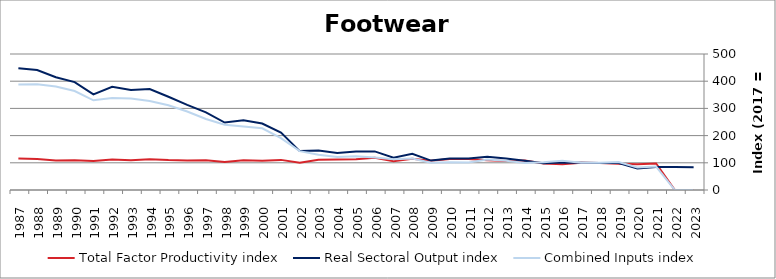
| Category | Total Factor Productivity index | Real Sectoral Output index | Combined Inputs index |
|---|---|---|---|
| 2023.0 | 0 | 83.648 | 0 |
| 2022.0 | 0 | 84.491 | 0 |
| 2021.0 | 97.686 | 84.185 | 86.18 |
| 2020.0 | 95.069 | 78.826 | 82.914 |
| 2019.0 | 96.535 | 99.028 | 102.582 |
| 2018.0 | 99.125 | 99.013 | 99.887 |
| 2017.0 | 100 | 100 | 100 |
| 2016.0 | 94.254 | 101.406 | 107.587 |
| 2015.0 | 97.122 | 98.709 | 101.635 |
| 2014.0 | 108.348 | 107.576 | 99.287 |
| 2013.0 | 106.946 | 115.383 | 107.889 |
| 2012.0 | 109.557 | 122.355 | 111.682 |
| 2011.0 | 114.334 | 115.851 | 101.327 |
| 2010.0 | 113.519 | 115.492 | 101.737 |
| 2009.0 | 107.527 | 108.194 | 100.62 |
| 2008.0 | 115.146 | 132.966 | 115.476 |
| 2007.0 | 105.307 | 118.771 | 112.786 |
| 2006.0 | 118.577 | 141.873 | 119.646 |
| 2005.0 | 113.436 | 141.118 | 124.403 |
| 2004.0 | 112.349 | 135.881 | 120.945 |
| 2003.0 | 111.471 | 144.789 | 129.89 |
| 2002.0 | 100.077 | 142.981 | 142.871 |
| 2001.0 | 110.725 | 210.814 | 190.394 |
| 2000.0 | 107.711 | 244.272 | 226.785 |
| 1999.0 | 109.799 | 256.366 | 233.487 |
| 1998.0 | 103.318 | 248.139 | 240.171 |
| 1997.0 | 109.295 | 285.503 | 261.223 |
| 1996.0 | 108.5 | 312.999 | 288.477 |
| 1995.0 | 109.978 | 342.748 | 311.651 |
| 1994.0 | 113.502 | 371.222 | 327.063 |
| 1993.0 | 109.138 | 367.256 | 336.505 |
| 1992.0 | 112.364 | 379.617 | 337.847 |
| 1991.0 | 106.643 | 351.691 | 329.784 |
| 1990.0 | 108.969 | 396.562 | 363.921 |
| 1989.0 | 108.895 | 414.739 | 380.862 |
| 1988.0 | 113.519 | 441.325 | 388.769 |
| 1987.0 | 115.424 | 447.825 | 387.984 |